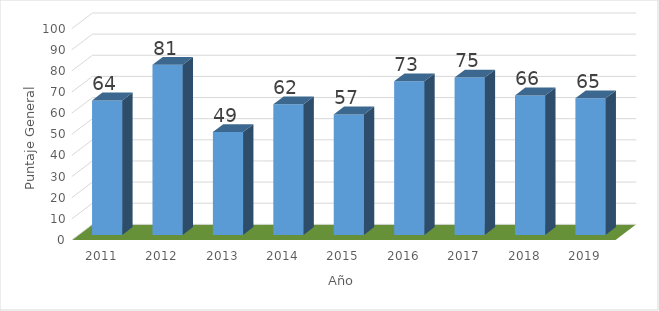
| Category | Puntaje global del IGI |
|---|---|
| 2011.0 | 63.65 |
| 2012.0 | 80.52 |
| 2013.0 | 48.7 |
| 2014.0 | 61.8 |
| 2015.0 | 57 |
| 2016.0 | 72.7 |
| 2017.0 | 74.5 |
| 2018.0 | 66 |
| 2019.0 | 64.65 |